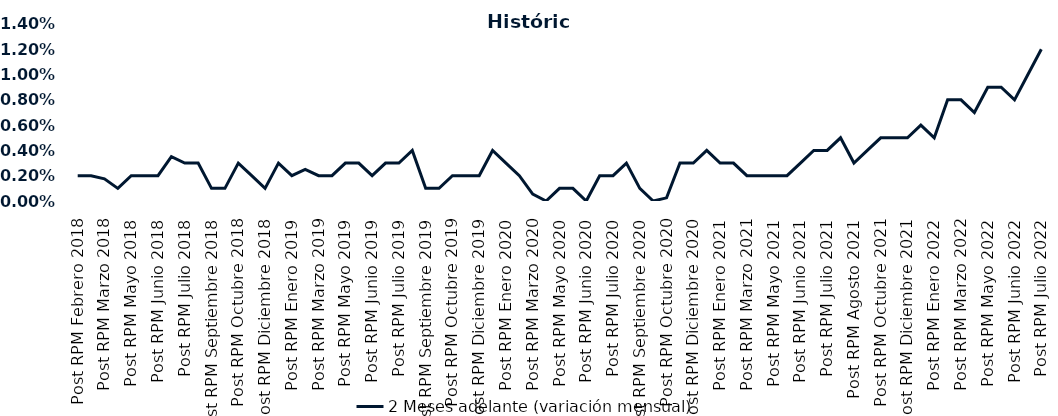
| Category | 2 Meses adelante (variación mensual) |
|---|---|
| Post RPM Febrero 2018 | 0.002 |
| Pre RPM Marzo 2018 | 0.002 |
| Post RPM Marzo 2018 | 0.002 |
| Pre RPM Mayo 2018 | 0.001 |
| Post RPM Mayo 2018 | 0.002 |
| Pre RPM Junio 2018 | 0.002 |
| Post RPM Junio 2018 | 0.002 |
| Pre RPM Julio 2018 | 0.004 |
| Post RPM Julio 2018 | 0.003 |
| Pre RPM Septiembre 2018 | 0.003 |
| Post RPM Septiembre 2018 | 0.001 |
| Pre RPM Octubre 2018 | 0.001 |
| Post RPM Octubre 2018 | 0.003 |
| Pre RPM Diciembre 2018 | 0.002 |
| Post RPM Diciembre 2018 | 0.001 |
| Pre RPM Enero 2019 | 0.003 |
| Post RPM Enero 2019 | 0.002 |
| Pre RPM Marzo 2019 | 0.002 |
| Post RPM Marzo 2019 | 0.002 |
| Pre RPM Mayo 2019 | 0.002 |
| Post RPM Mayo 2019 | 0.003 |
| Pre RPM Junio 2019 | 0.003 |
| Post RPM Junio 2019 | 0.002 |
| Pre RPM Julio 2019 | 0.003 |
| Post RPM Julio 2019 | 0.003 |
| Pre RPM Septiembre 2019 | 0.004 |
| Post RPM Septiembre 2019 | 0.001 |
| Pre RPM Octubre 2019 | 0.001 |
| Post RPM Octubre 2019 | 0.002 |
| Pre RPM Diciembre 2019 | 0.002 |
| Post RPM Diciembre 2019 | 0.002 |
| Pre RPM Enero 2020 | 0.004 |
| Post RPM Enero 2020 | 0.003 |
| Pre RPM Marzo 2020 | 0.002 |
| Post RPM Marzo 2020 | 0.001 |
| Pre RPM Mayo 2020 | 0 |
| Post RPM Mayo 2020 | 0.001 |
| Pre RPM Junio 2020 | 0.001 |
| Post RPM Junio 2020 | 0 |
| Pre RPM Julio 2020 | 0.002 |
| Post RPM Julio 2020 | 0.002 |
| Pre RPM Septiembre 2020 | 0.003 |
| Post RPM Septiembre 2020 | 0.001 |
| Pre RPM Octubre 2020 | 0 |
| Post RPM Octubre 2020 | 0 |
| Pre RPM Diciembre 2020 | 0.003 |
| Post RPM Diciembre 2020 | 0.003 |
| Pre RPM Enero 2021 | 0.004 |
| Post RPM Enero 2021 | 0.003 |
| Pre RPM Marzo 2021 | 0.003 |
| Post RPM Marzo 2021 | 0.002 |
| Pre RPM Mayo 2021 | 0.002 |
| Post RPM Mayo 2021 | 0.002 |
| Pre RPM Junio 2021 | 0.002 |
| Post RPM Junio 2021 | 0.003 |
| Pre RPM Julio 2021 | 0.004 |
| Post RPM Julio 2021 | 0.004 |
| Pre RPM Agosto 2021 | 0.005 |
| Post RPM Agosto 2021 | 0.003 |
| Pre RPM Octubre 2021 | 0.004 |
| Post RPM Octubre 2021 | 0.005 |
| Pre RPM Diciembre 2021 | 0.005 |
| Post RPM Diciembre 2021 | 0.005 |
| Pre RPM Enero 2022 | 0.006 |
| Post RPM Enero 2022 | 0.005 |
| Pre RPM Marzo 2022 | 0.008 |
| Post RPM Marzo 2022 | 0.008 |
| Pre RPM Mayo 2022 | 0.007 |
| Post RPM Mayo 2022 | 0.009 |
| Pre RPM Junio 2022 | 0.009 |
| Post RPM Junio 2022 | 0.008 |
| Pre RPM Julio 2022 | 0.01 |
| Post RPM Julio 2022 | 0.012 |